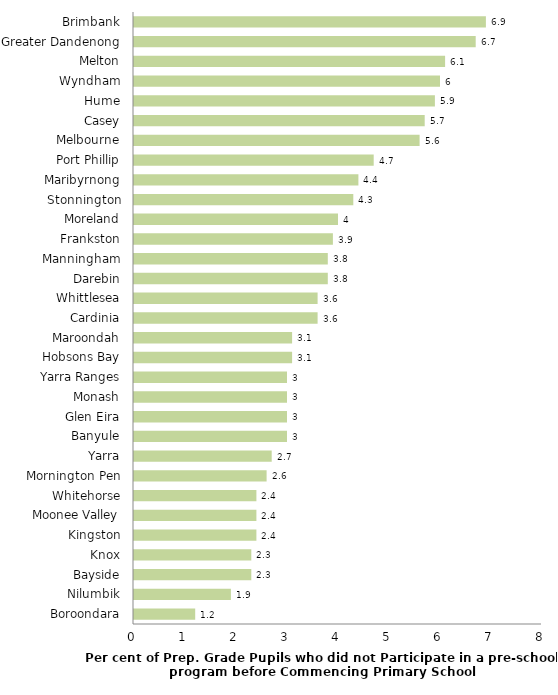
| Category | Series 0 |
|---|---|
| Boroondara | 1.2 |
| Nilumbik | 1.9 |
| Bayside | 2.3 |
| Knox | 2.3 |
| Kingston | 2.4 |
| Moonee Valley | 2.4 |
| Whitehorse | 2.4 |
| Mornington Pen | 2.6 |
| Yarra | 2.7 |
| Banyule | 3 |
| Glen Eira | 3 |
| Monash | 3 |
| Yarra Ranges | 3 |
| Hobsons Bay | 3.1 |
| Maroondah | 3.1 |
| Cardinia | 3.6 |
| Whittlesea | 3.6 |
| Darebin | 3.8 |
| Manningham | 3.8 |
| Frankston | 3.9 |
| Moreland | 4 |
| Stonnington | 4.3 |
| Maribyrnong | 4.4 |
| Port Phillip | 4.7 |
| Melbourne | 5.6 |
| Casey | 5.7 |
| Hume | 5.9 |
| Wyndham | 6 |
| Melton | 6.1 |
| Greater Dandenong | 6.7 |
| Brimbank | 6.9 |